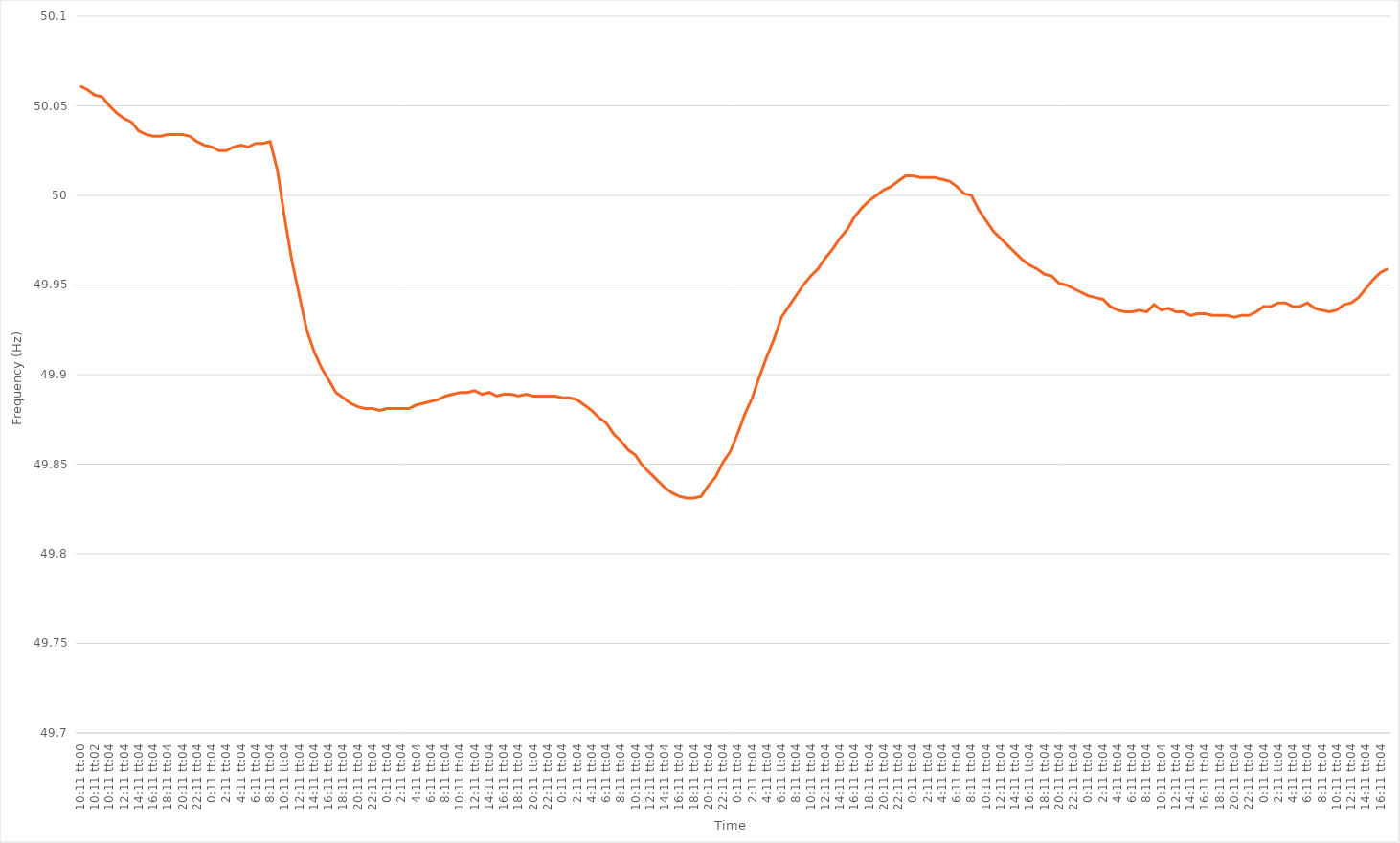
| Category | Series 0 |
|---|---|
| 0.42430555555555555 | 50.061 |
| 0.4243171296296296 | 50.059 |
| 0.42432870370370374 | 50.056 |
| 0.4243402777777778 | 50.055 |
| 0.42435185185185187 | 50.05 |
| 0.466018518518519 | 50.046 |
| 0.507685185185185 | 50.043 |
| 0.549351851851852 | 50.041 |
| 0.591018518518518 | 50.036 |
| 0.632685185185185 | 50.034 |
| 0.674351851851852 | 50.033 |
| 0.716018518518519 | 50.033 |
| 0.757685185185185 | 50.034 |
| 0.799351851851852 | 50.034 |
| 0.841018518518519 | 50.034 |
| 0.882685185185185 | 50.033 |
| 0.924351851851852 | 50.03 |
| 0.966018518518518 | 50.028 |
| 1900-01-01 00:11:04 | 50.027 |
| 1900-01-01 01:11:04 | 50.025 |
| 1900-01-01 02:11:04 | 50.025 |
| 1900-01-01 03:11:04 | 50.027 |
| 1900-01-01 04:11:04 | 50.028 |
| 1900-01-01 05:11:04 | 50.027 |
| 1900-01-01 06:11:04 | 50.029 |
| 1900-01-01 07:11:04 | 50.029 |
| 1900-01-01 08:11:04 | 50.03 |
| 1900-01-01 09:11:04 | 50.014 |
| 1900-01-01 10:11:04 | 49.987 |
| 1900-01-01 11:11:04 | 49.963 |
| 1900-01-01 12:11:04 | 49.944 |
| 1900-01-01 13:11:04 | 49.925 |
| 1900-01-01 14:11:04 | 49.913 |
| 1900-01-01 15:11:04 | 49.904 |
| 1900-01-01 16:11:04 | 49.897 |
| 1900-01-01 17:11:04 | 49.89 |
| 1900-01-01 18:11:04 | 49.887 |
| 1900-01-01 19:11:04 | 49.884 |
| 1900-01-01 20:11:04 | 49.882 |
| 1900-01-01 21:11:04 | 49.881 |
| 1900-01-01 22:11:04 | 49.881 |
| 1900-01-01 23:11:04 | 49.88 |
| 1900-01-02 00:11:04 | 49.881 |
| 1900-01-02 01:11:04 | 49.881 |
| 1900-01-02 02:11:04 | 49.881 |
| 1900-01-02 03:11:04 | 49.881 |
| 1900-01-02 04:11:04 | 49.883 |
| 1900-01-02 05:11:04 | 49.884 |
| 1900-01-02 06:11:04 | 49.885 |
| 1900-01-02 07:11:04 | 49.886 |
| 1900-01-02 08:11:04 | 49.888 |
| 1900-01-02 09:11:04 | 49.889 |
| 1900-01-02 10:11:04 | 49.89 |
| 1900-01-02 11:11:04 | 49.89 |
| 1900-01-02 12:11:04 | 49.891 |
| 1900-01-02 13:11:04 | 49.889 |
| 1900-01-02 14:11:04 | 49.89 |
| 1900-01-02 15:11:04 | 49.888 |
| 1900-01-02 16:11:04 | 49.889 |
| 1900-01-02 17:11:04 | 49.889 |
| 1900-01-02 18:11:04 | 49.888 |
| 1900-01-02 19:11:04 | 49.889 |
| 1900-01-02 20:11:04 | 49.888 |
| 1900-01-02 21:11:04 | 49.888 |
| 1900-01-02 22:11:04 | 49.888 |
| 1900-01-02 23:11:04 | 49.888 |
| 1900-01-03 00:11:04 | 49.887 |
| 1900-01-03 01:11:04 | 49.887 |
| 1900-01-03 02:11:04 | 49.886 |
| 1900-01-03 03:11:04 | 49.883 |
| 1900-01-03 04:11:04 | 49.88 |
| 1900-01-03 05:11:04 | 49.876 |
| 1900-01-03 06:11:04 | 49.873 |
| 1900-01-03 07:11:04 | 49.867 |
| 1900-01-03 08:11:04 | 49.863 |
| 1900-01-03 09:11:04 | 49.858 |
| 1900-01-03 10:11:04 | 49.855 |
| 1900-01-03 11:11:04 | 49.849 |
| 1900-01-03 12:11:04 | 49.845 |
| 1900-01-03 13:11:04 | 49.841 |
| 1900-01-03 14:11:04 | 49.837 |
| 1900-01-03 15:11:04 | 49.834 |
| 1900-01-03 16:11:04 | 49.832 |
| 1900-01-03 17:11:04 | 49.831 |
| 1900-01-03 18:11:04 | 49.831 |
| 1900-01-03 19:11:04 | 49.832 |
| 1900-01-03 20:11:04 | 49.838 |
| 1900-01-03 21:11:04 | 49.843 |
| 1900-01-03 22:11:04 | 49.851 |
| 1900-01-03 23:11:04 | 49.857 |
| 1900-01-04 00:11:04 | 49.867 |
| 1900-01-04 01:11:04 | 49.878 |
| 1900-01-04 02:11:04 | 49.887 |
| 1900-01-04 03:11:04 | 49.899 |
| 1900-01-04 04:11:04 | 49.91 |
| 1900-01-04 05:11:04 | 49.92 |
| 1900-01-04 06:11:04 | 49.932 |
| 1900-01-04 07:11:04 | 49.938 |
| 1900-01-04 08:11:04 | 49.944 |
| 1900-01-04 09:11:04 | 49.95 |
| 1900-01-04 10:11:04 | 49.955 |
| 1900-01-04 11:11:04 | 49.959 |
| 1900-01-04 12:11:04 | 49.965 |
| 1900-01-04 13:11:04 | 49.97 |
| 1900-01-04 14:11:04 | 49.976 |
| 1900-01-04 15:11:04 | 49.981 |
| 1900-01-04 16:11:04 | 49.988 |
| 1900-01-04 17:11:04 | 49.993 |
| 1900-01-04 18:11:04 | 49.997 |
| 1900-01-04 19:11:04 | 50 |
| 1900-01-04 20:11:04 | 50.003 |
| 1900-01-04 21:11:04 | 50.005 |
| 1900-01-04 22:11:04 | 50.008 |
| 1900-01-04 23:11:04 | 50.011 |
| 1900-01-05 00:11:04 | 50.011 |
| 1900-01-05 01:11:04 | 50.01 |
| 1900-01-05 02:11:04 | 50.01 |
| 1900-01-05 03:11:04 | 50.01 |
| 1900-01-05 04:11:04 | 50.009 |
| 1900-01-05 05:11:04 | 50.008 |
| 1900-01-05 06:11:04 | 50.005 |
| 1900-01-05 07:11:04 | 50.001 |
| 1900-01-05 08:11:04 | 50 |
| 1900-01-05 09:11:04 | 49.992 |
| 1900-01-05 10:11:04 | 49.986 |
| 1900-01-05 11:11:04 | 49.98 |
| 1900-01-05 12:11:04 | 49.976 |
| 1900-01-05 13:11:04 | 49.972 |
| 1900-01-05 14:11:04 | 49.968 |
| 1900-01-05 15:11:04 | 49.964 |
| 1900-01-05 16:11:04 | 49.961 |
| 1900-01-05 17:11:04 | 49.959 |
| 1900-01-05 18:11:04 | 49.956 |
| 1900-01-05 19:11:04 | 49.955 |
| 1900-01-05 20:11:04 | 49.951 |
| 1900-01-05 21:11:04 | 49.95 |
| 1900-01-05 22:11:04 | 49.948 |
| 1900-01-05 23:11:04 | 49.946 |
| 1900-01-06 00:11:04 | 49.944 |
| 1900-01-06 01:11:04 | 49.943 |
| 1900-01-06 02:11:04 | 49.942 |
| 1900-01-06 03:11:04 | 49.938 |
| 1900-01-06 04:11:04 | 49.936 |
| 1900-01-06 05:11:04 | 49.935 |
| 1900-01-06 06:11:04 | 49.935 |
| 1900-01-06 07:11:04 | 49.936 |
| 1900-01-06 08:11:04 | 49.935 |
| 1900-01-06 09:11:04 | 49.939 |
| 1900-01-06 10:11:04 | 49.936 |
| 1900-01-06 11:11:04 | 49.937 |
| 1900-01-06 12:11:04 | 49.935 |
| 1900-01-06 13:11:04 | 49.935 |
| 1900-01-06 14:11:04 | 49.933 |
| 1900-01-06 15:11:04 | 49.934 |
| 1900-01-06 16:11:04 | 49.934 |
| 1900-01-06 17:11:04 | 49.933 |
| 1900-01-06 18:11:04 | 49.933 |
| 1900-01-06 19:11:04 | 49.933 |
| 1900-01-06 20:11:04 | 49.932 |
| 1900-01-06 21:11:04 | 49.933 |
| 1900-01-06 22:11:04 | 49.933 |
| 1900-01-06 23:11:04 | 49.935 |
| 1900-01-07 00:11:04 | 49.938 |
| 1900-01-07 01:11:04 | 49.938 |
| 1900-01-07 02:11:04 | 49.94 |
| 1900-01-07 03:11:04 | 49.94 |
| 1900-01-07 04:11:04 | 49.938 |
| 1900-01-07 05:11:04 | 49.938 |
| 1900-01-07 06:11:04 | 49.94 |
| 1900-01-07 07:11:04 | 49.937 |
| 1900-01-07 08:11:04 | 49.936 |
| 1900-01-07 09:11:04 | 49.935 |
| 1900-01-07 10:11:04 | 49.936 |
| 1900-01-07 11:11:04 | 49.939 |
| 1900-01-07 12:11:04 | 49.94 |
| 1900-01-07 13:11:04 | 49.943 |
| 1900-01-07 14:11:04 | 49.948 |
| 1900-01-07 15:11:04 | 49.953 |
| 1900-01-07 16:11:04 | 49.957 |
| 1900-01-07 17:11:04 | 49.959 |